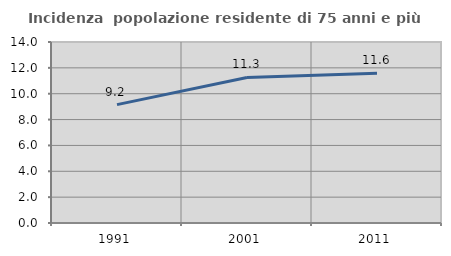
| Category | Incidenza  popolazione residente di 75 anni e più |
|---|---|
| 1991.0 | 9.158 |
| 2001.0 | 11.255 |
| 2011.0 | 11.592 |